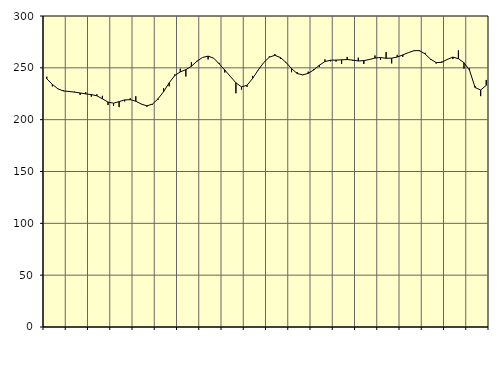
| Category | Piggar | Series 1 |
|---|---|---|
| nan | 241.4 | 239.41 |
| 1.0 | 232.1 | 234.05 |
| 1.0 | 229.5 | 229.72 |
| 1.0 | 228.3 | 227.68 |
| nan | 227.7 | 227.21 |
| 2.0 | 227 | 226.55 |
| 2.0 | 223.8 | 225.75 |
| 2.0 | 226.5 | 224.85 |
| nan | 222.2 | 224.18 |
| 3.0 | 224.5 | 223.05 |
| 3.0 | 223 | 220.13 |
| 3.0 | 214.1 | 216.94 |
| nan | 213.3 | 215.94 |
| 4.0 | 212.1 | 217.38 |
| 4.0 | 217.6 | 219.06 |
| 4.0 | 220.6 | 219.3 |
| nan | 222.6 | 217.79 |
| 5.0 | 215.2 | 215.05 |
| 5.0 | 212.5 | 213.34 |
| 5.0 | 214.5 | 215.04 |
| nan | 219.1 | 220.1 |
| 6.0 | 230.3 | 227.04 |
| 6.0 | 232.2 | 235.52 |
| 6.0 | 243.6 | 242.58 |
| nan | 249.2 | 246.1 |
| 7.0 | 241.6 | 248.22 |
| 7.0 | 255.3 | 251.53 |
| 7.0 | 256.8 | 256.37 |
| nan | 259.9 | 260.01 |
| 8.0 | 258.1 | 261.28 |
| 8.0 | 259.5 | 259.37 |
| 8.0 | 254.8 | 253.86 |
| nan | 245.5 | 247.85 |
| 9.0 | 242.1 | 241.71 |
| 9.0 | 225.5 | 235.55 |
| 9.0 | 229.1 | 231.61 |
| nan | 231.5 | 233.21 |
| 10.0 | 242.2 | 239.75 |
| 10.0 | 247.6 | 247.79 |
| 10.0 | 255.2 | 255.07 |
| nan | 260.9 | 260.26 |
| 11.0 | 263.2 | 262.07 |
| 11.0 | 258.6 | 259.95 |
| 11.0 | 254.8 | 255.22 |
| nan | 245.8 | 249.28 |
| 12.0 | 245.9 | 244.56 |
| 12.0 | 242.9 | 243.22 |
| 12.0 | 246.3 | 244.65 |
| nan | 248.9 | 248.05 |
| 13.0 | 250.8 | 252.5 |
| 13.0 | 258.1 | 256.04 |
| 13.0 | 256.3 | 257.33 |
| nan | 256 | 257.5 |
| 14.0 | 253.8 | 257.73 |
| 14.0 | 260.5 | 257.99 |
| 14.0 | 256.8 | 257.48 |
| nan | 259.8 | 256.6 |
| 15.0 | 253.7 | 256.98 |
| 15.0 | 257.6 | 258.03 |
| 15.0 | 261.9 | 259.47 |
| nan | 257.7 | 259.93 |
| 16.0 | 265.2 | 259.2 |
| 16.0 | 254.3 | 259.33 |
| 16.0 | 262.5 | 260.45 |
| nan | 260.7 | 262.44 |
| 17.0 | 264.8 | 264.65 |
| 17.0 | 266.3 | 266.5 |
| 17.0 | 266.1 | 266.64 |
| nan | 264.5 | 263.43 |
| 18.0 | 257.7 | 258.32 |
| 18.0 | 254.1 | 255.08 |
| 18.0 | 256.1 | 255.27 |
| nan | 258.4 | 258.1 |
| 19.0 | 258.5 | 260.35 |
| 19.0 | 266.8 | 258.85 |
| 19.0 | 249.2 | 254.92 |
| nan | 249.4 | 247.71 |
| 20.0 | 232.3 | 230.98 |
| 20.0 | 222.7 | 228.6 |
| 20.0 | 238.3 | 233.05 |